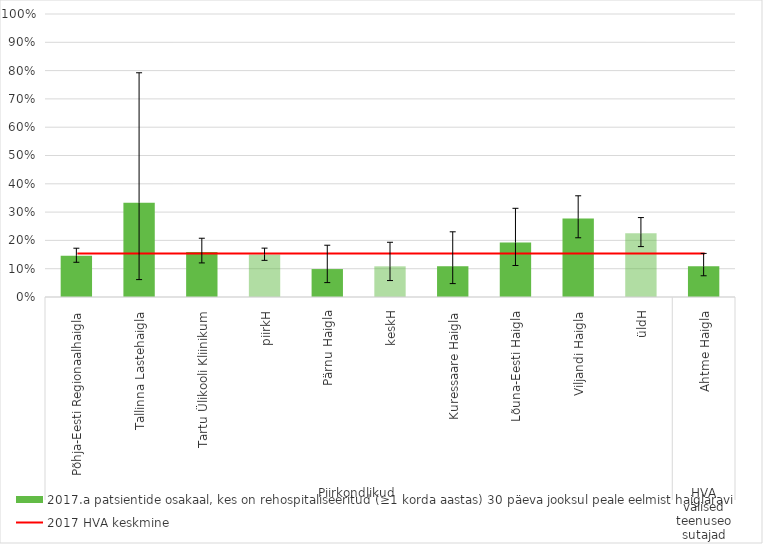
| Category | 2017.a patsientide osakaal, kes on rehospitaliseeritud (≥1 korda aastas) 30 päeva jooksul peale eelmist haiglaravi |
|---|---|
| 0 | 0.146 |
| 1 | 0.333 |
| 2 | 0.159 |
| 3 | 0.15 |
| 4 | 0.099 |
| 5 | 0.108 |
| 6 | 0.109 |
| 7 | 0.193 |
| 8 | 0.277 |
| 9 | 0.225 |
| 10 | 0.108 |